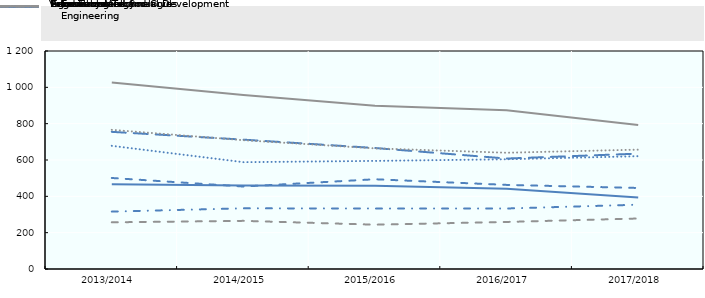
| Category | Agriculture | Forest | Food Technology | Environment and Civil Engineering | Veterinary Medicine | Economics and Social Development | Information Technologies | Engineering |
|---|---|---|---|---|---|---|---|---|
| 2013/2014 | 467 | 755 | 501 | 678 | 316 | 1026 | 257 | 766 |
| 2014/2015 | 460 | 712 | 454 | 588 | 334 | 958 | 265 | 709 |
| 2015/2016 | 458 | 666 | 494 | 595 | 333 | 899 | 244 | 664 |
| 2016/2017 | 442 | 608 | 463 | 604 | 333 | 874 | 259 | 640 |
| 2017/2018 | 394 | 635 | 446 | 621 | 354 | 793 | 278 | 657 |